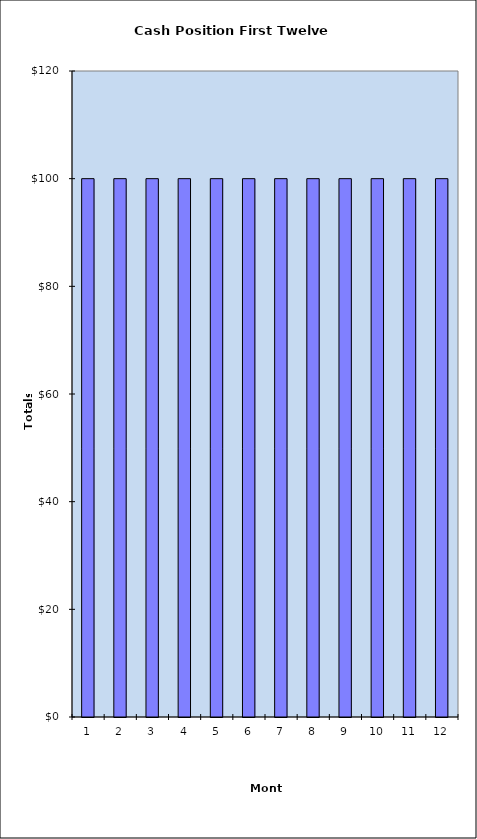
| Category | Series 0 |
|---|---|
| 0 | 100 |
| 1 | 100 |
| 2 | 100 |
| 3 | 100 |
| 4 | 100 |
| 5 | 100 |
| 6 | 100 |
| 7 | 100 |
| 8 | 100 |
| 9 | 100 |
| 10 | 100 |
| 11 | 100 |